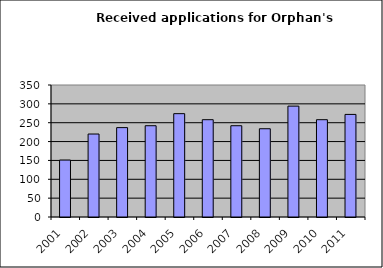
| Category | Series 1 |
|---|---|
| 2001.0 | 151 |
| 2002.0 | 220 |
| 2003.0 | 237 |
| 2004.0 | 242 |
| 2005.0 | 274 |
| 2006.0 | 258 |
| 2007.0 | 242 |
| 2008.0 | 234 |
| 2009.0 | 294 |
| 2010.0 | 258 |
| 2011.0 | 272 |